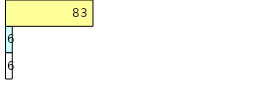
| Category | Total Standouts | Total Recd | Total Tipsters |
|---|---|---|---|
| 0 | 6 | 6 | 83 |